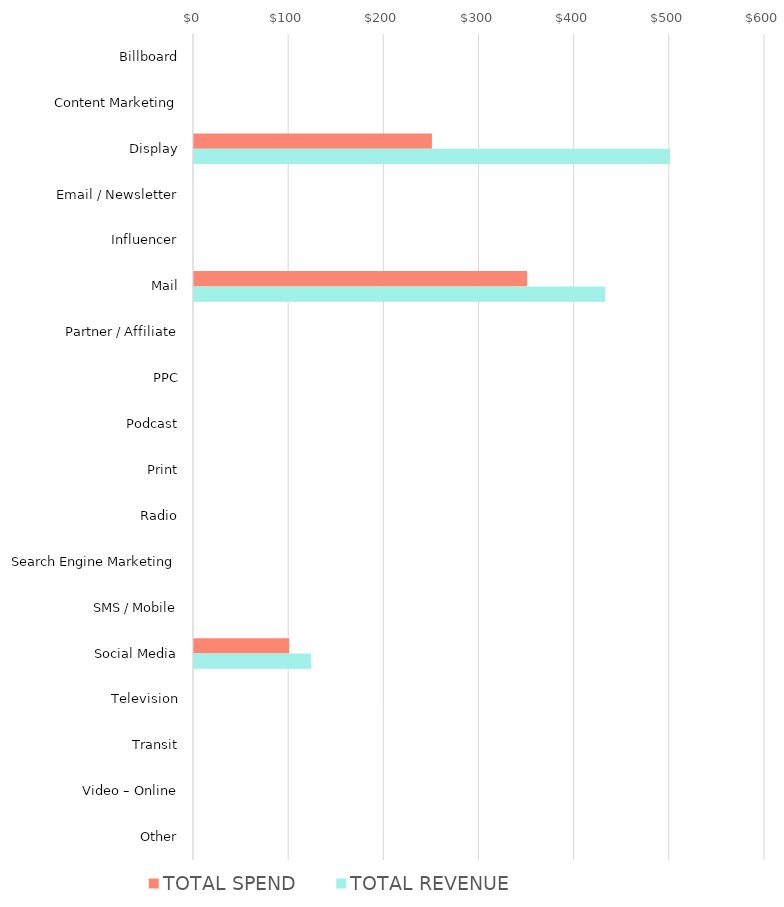
| Category | TOTAL SPEND | TOTAL REVENUE |
|---|---|---|
| Billboard | 0 | 0 |
| Content Marketing | 0 | 0 |
| Display | 250 | 500 |
| Email / Newsletter | 0 | 0 |
| Influencer | 0 | 0 |
| Mail | 350 | 432 |
| Partner / Affiliate | 0 | 0 |
| PPC | 0 | 0 |
| Podcast | 0 | 0 |
| Print | 0 | 0 |
| Radio | 0 | 0 |
| Search Engine Marketing | 0 | 0 |
| SMS / Mobile | 0 | 0 |
| Social Media | 100 | 123 |
| Television | 0 | 0 |
| Transit | 0 | 0 |
| Video – Online | 0 | 0 |
| Other | 0 | 0 |